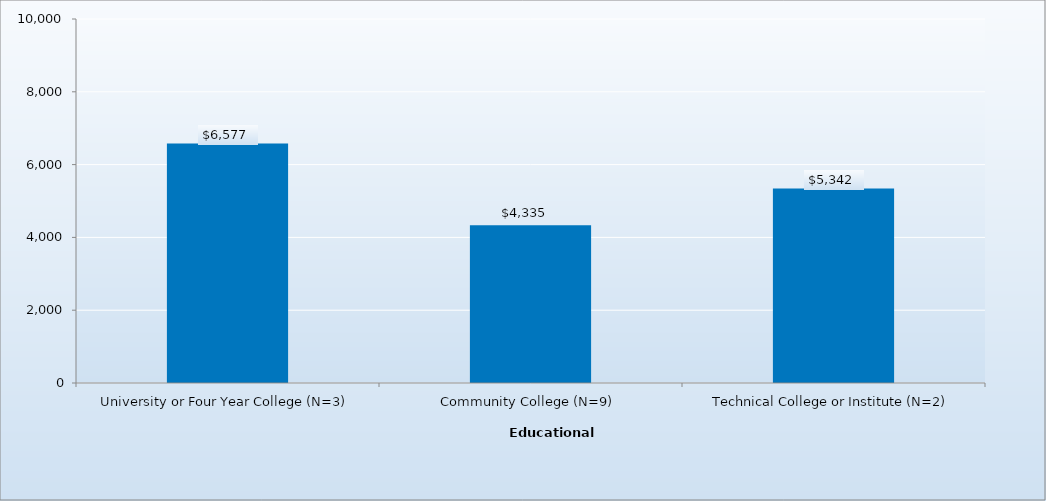
| Category | Series 0 |
|---|---|
| University or Four Year College (N=3) | 6577 |
| Community College (N=9) | 4335 |
| Technical College or Institute (N=2) | 5342 |